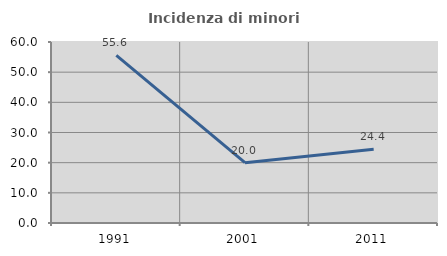
| Category | Incidenza di minori stranieri |
|---|---|
| 1991.0 | 55.556 |
| 2001.0 | 20 |
| 2011.0 | 24.444 |